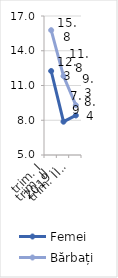
| Category | Femei | Bărbați |
|---|---|---|
| trim. I
2019 | 12.25 | 15.775 |
| trim. II
2019 | 7.876 | 11.811 |
| trim. III
2019 | 8.414 | 9.302 |